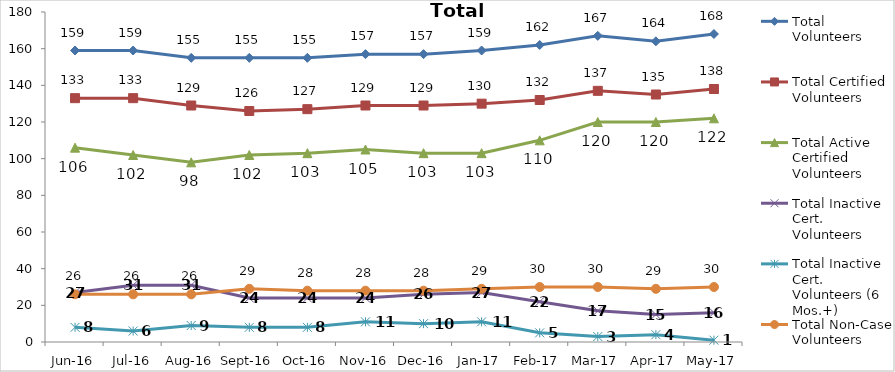
| Category | Total Volunteers | Total Certified Volunteers | Total Active Certified Volunteers | Total Inactive Cert. Volunteers | Total Inactive Cert. Volunteers (6 Mos.+) | Total Non-Case Volunteers |
|---|---|---|---|---|---|---|
| Jun-16 | 159 | 133 | 106 | 27 | 8 | 26 |
| Jul-16 | 159 | 133 | 102 | 31 | 6 | 26 |
| Aug-16 | 155 | 129 | 98 | 31 | 9 | 26 |
| Sep-16 | 155 | 126 | 102 | 24 | 8 | 29 |
| Oct-16 | 155 | 127 | 103 | 24 | 8 | 28 |
| Nov-16 | 157 | 129 | 105 | 24 | 11 | 28 |
| Dec-16 | 157 | 129 | 103 | 26 | 10 | 28 |
| Jan-17 | 159 | 130 | 103 | 27 | 11 | 29 |
| Feb-17 | 162 | 132 | 110 | 22 | 5 | 30 |
| Mar-17 | 167 | 137 | 120 | 17 | 3 | 30 |
| Apr-17 | 164 | 135 | 120 | 15 | 4 | 29 |
| May-17 | 168 | 138 | 122 | 16 | 1 | 30 |